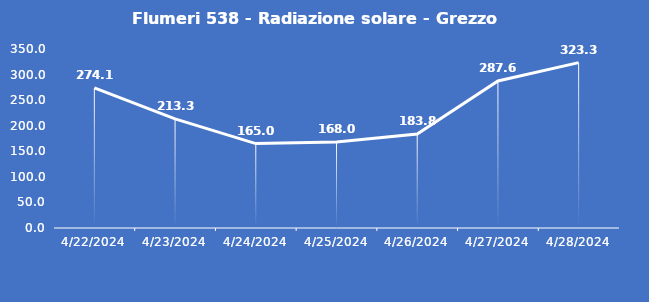
| Category | Flumeri 538 - Radiazione solare - Grezzo (W/m2) |
|---|---|
| 4/22/24 | 274.1 |
| 4/23/24 | 213.3 |
| 4/24/24 | 165 |
| 4/25/24 | 168 |
| 4/26/24 | 183.8 |
| 4/27/24 | 287.6 |
| 4/28/24 | 323.3 |